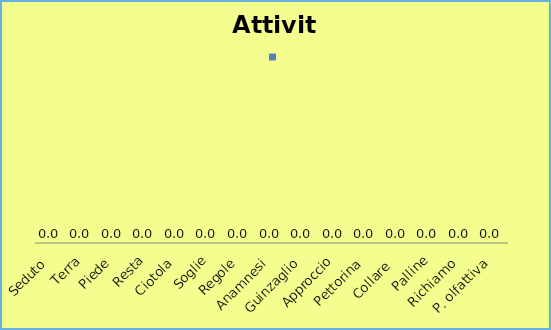
| Category | Series 0 |
|---|---|
| Seduto | 0 |
| Terra | 0 |
| Piede | 0 |
| Resta | 0 |
| Ciotola | 0 |
| Soglie | 0 |
| Regole | 0 |
| Anamnesi | 0 |
| Guinzaglio | 0 |
| Approccio | 0 |
| Pettorina | 0 |
| Collare  | 0 |
| Palline | 0 |
| Richiamo | 0 |
| P. olfattiva | 0 |